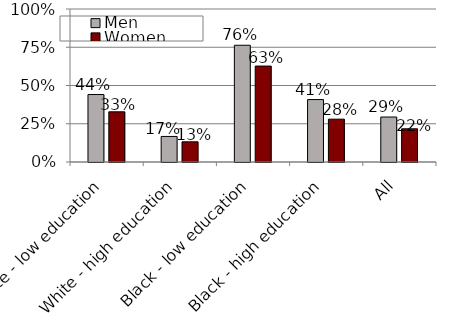
| Category | Men | Women |
|---|---|---|
| White - low education | 0.441 | 0.328 |
| White - high education | 0.167 | 0.132 |
| Black - low education | 0.763 | 0.627 |
| Black - high education | 0.408 | 0.28 |
| All | 0.294 | 0.217 |